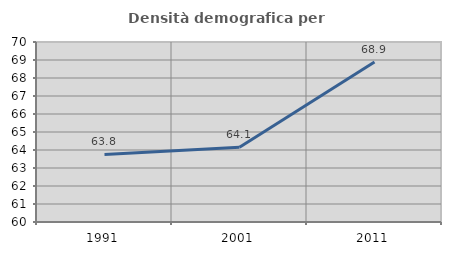
| Category | Densità demografica |
|---|---|
| 1991.0 | 63.755 |
| 2001.0 | 64.148 |
| 2011.0 | 68.89 |